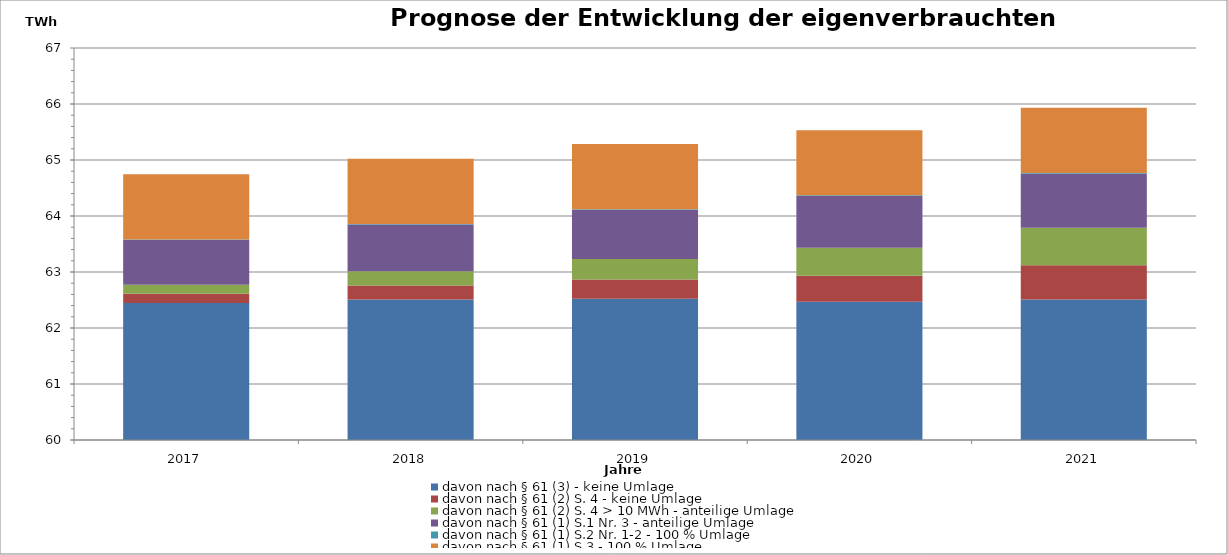
| Category | davon nach § 61 (3) - keine Umlage | davon nach § 61 (2) S. 4 - keine Umlage | davon nach § 61 (2) S. 4 > 10 MWh - anteilige Umlage | davon nach § 61 (1) S.1 Nr. 3 - anteilige Umlage | davon nach § 61 (1) S.2 Nr. 1-2 - 100 % Umlage | davon nach § 61 (1) S.3 - 100 % Umlage |
|---|---|---|---|---|---|---|
| 2017.0 | 62.446 | 0.168 | 0.16 | 0.795 | 0.011 | 1.163 |
| 2018.0 | 62.51 | 0.249 | 0.253 | 0.835 | 0.012 | 1.163 |
| 2019.0 | 62.522 | 0.346 | 0.364 | 0.877 | 0.012 | 1.163 |
| 2020.0 | 62.469 | 0.464 | 0.502 | 0.921 | 0.013 | 1.163 |
| 2021.0 | 62.511 | 0.612 | 0.667 | 0.967 | 0.014 | 1.163 |